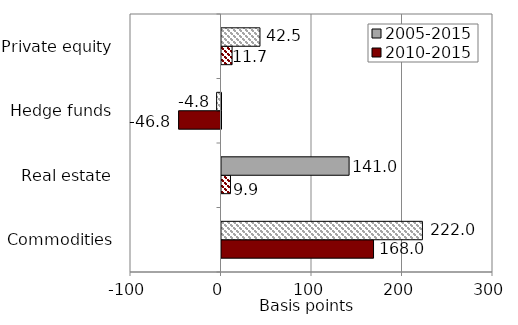
| Category | 2010-2015 | 2005-2015 |
|---|---|---|
| Commodities | 168 | 222 |
| Real estate | 9.92 | 141 |
| Hedge funds | -46.8 | -4.82 |
| Private equity | 11.7 | 42.5 |